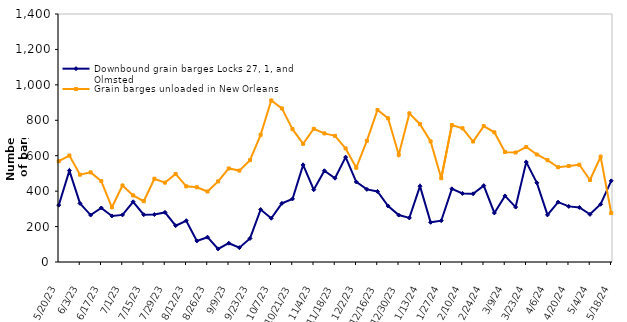
| Category | Downbound grain barges Locks 27, 1, and Olmsted | Grain barges unloaded in New Orleans  |
|---|---|---|
| 5/20/23 | 321 | 569 |
| 5/27/23 | 516 | 601 |
| 6/3/23 | 331 | 493 |
| 6/10/23 | 265 | 506 |
| 6/17/23 | 305 | 457 |
| 6/24/23 | 260 | 309 |
| 7/1/23 | 266 | 432 |
| 7/8/23 | 340 | 376 |
| 7/15/23 | 267 | 343 |
| 7/22/23 | 268 | 470 |
| 7/29/23 | 280 | 448 |
| 8/5/23 | 205 | 497 |
| 8/12/23 | 233 | 427 |
| 8/19/23 | 119 | 422 |
| 8/26/23 | 140 | 398 |
| 9/2/23 | 74 | 455 |
| 9/9/23 | 106 | 528 |
| 9/16/23 | 81 | 516 |
| 9/23/23 | 133 | 575 |
| 9/30/23 | 296 | 718 |
| 10/7/23 | 247 | 912 |
| 10/14/23 | 331 | 867 |
| 10/21/23 | 356 | 750 |
| 10/28/23 | 548 | 667 |
| 11/4/23 | 408 | 752 |
| 11/11/23 | 515 | 726 |
| 11/18/23 | 473 | 712 |
| 11/25/23 | 592 | 641 |
| 12/2/23 | 452 | 532 |
| 12/9/23 | 410 | 684 |
| 12/16/23 | 398 | 858 |
| 12/23/23 | 316 | 811 |
| 12/30/23 | 265 | 605 |
| 1/6/24 | 249 | 839 |
| 1/13/24 | 428 | 778 |
| 1/20/24 | 224 | 681 |
| 1/27/24 | 233 | 473 |
| 2/3/24 | 413 | 773 |
| 2/10/24 | 387 | 755 |
| 2/17/24 | 385 | 680 |
| 2/24/24 | 431 | 767 |
| 3/2/24 | 277 | 732 |
| 3/9/24 | 373 | 621 |
| 3/16/24 | 310 | 618 |
| 3/23/24 | 564 | 649 |
| 3/30/24 | 447 | 607 |
| 4/6/24 | 266 | 575 |
| 4/13/24 | 338 | 535 |
| 4/20/24 | 314 | 542 |
| 4/27/24 | 308 | 549 |
| 5/4/24 | 269 | 463 |
| 5/11/24 | 326 | 594 |
| 5/18/24 | 458 | 276 |